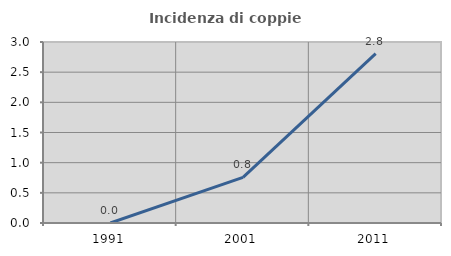
| Category | Incidenza di coppie miste |
|---|---|
| 1991.0 | 0 |
| 2001.0 | 0.756 |
| 2011.0 | 2.807 |